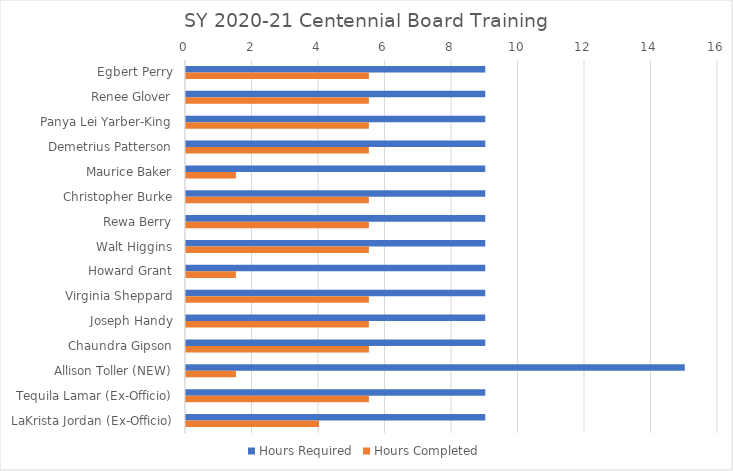
| Category | Hours Required | Hours Completed |
|---|---|---|
| Egbert Perry | 9 | 5.5 |
| Renee Glover | 9 | 5.5 |
| Panya Lei Yarber-King | 9 | 5.5 |
| Demetrius Patterson | 9 | 5.5 |
| Maurice Baker | 9 | 1.5 |
| Christopher Burke | 9 | 5.5 |
| Rewa Berry | 9 | 5.5 |
| Walt Higgins | 9 | 5.5 |
| Howard Grant | 9 | 1.5 |
| Virginia Sheppard | 9 | 5.5 |
| Joseph Handy | 9 | 5.5 |
| Chaundra Gipson | 9 | 5.5 |
| Allison Toller (NEW) | 15 | 1.5 |
| Tequila Lamar (Ex-Officio) | 9 | 5.5 |
| LaKrista Jordan (Ex-Officio) | 9 | 4 |